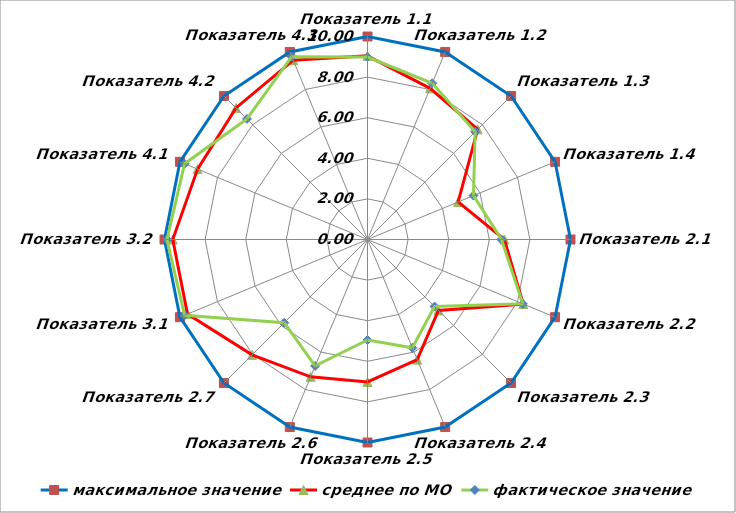
| Category | максимальное значение | среднее по МО | фактическое значение |
|---|---|---|---|
| Показатель 1.1 | 10 | 9.046 | 8.99 |
| Показатель 1.2 | 10 | 8.061 | 8.33 |
| Показатель 1.3 | 10 | 7.673 | 7.5 |
| Показатель 1.4 | 10 | 4.833 | 5.65 |
| Показатель 2.1 | 10 | 6.745 | 6.6 |
| Показатель 2.2 | 10 | 8.305 | 8.28 |
| Показатель 2.3 | 10 | 4.943 | 4.67 |
| Показатель 2.4 | 10 | 6.405 | 5.77 |
| Показатель 2.5 | 10 | 7.017 | 4.95 |
| Показатель 2.6 | 10 | 7.323 | 6.74 |
| Показатель 2.7 | 10 | 8.039 | 5.8 |
| Показатель 3.1 | 10 | 9.599 | 9.75 |
| Показатель 3.2 | 10 | 9.593 | 9.88 |
| Показатель 4.1 | 10 | 9.059 | 9.75 |
| Показатель 4.2 | 10 | 9.164 | 8.4 |
| Показатель 4.3 | 10 | 9.561 | 9.75 |